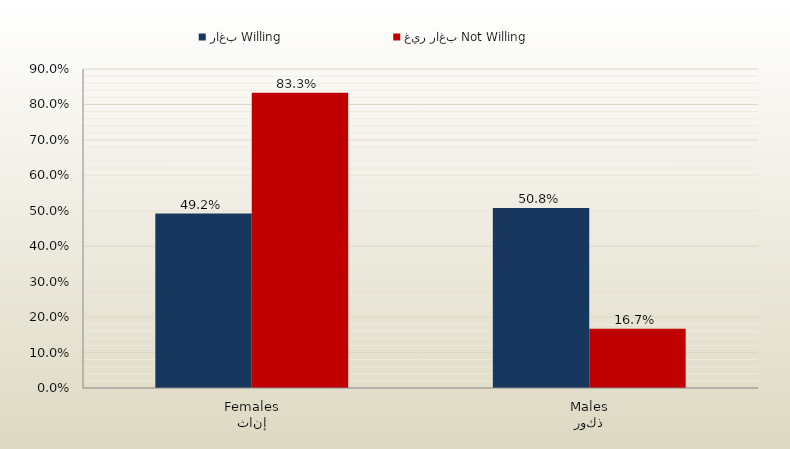
| Category | راغب Willing | غير راغب Not Willing |
|---|---|---|
| إناث
Females | 0.492 | 0.833 |
| ذكور
Males | 0.508 | 0.167 |